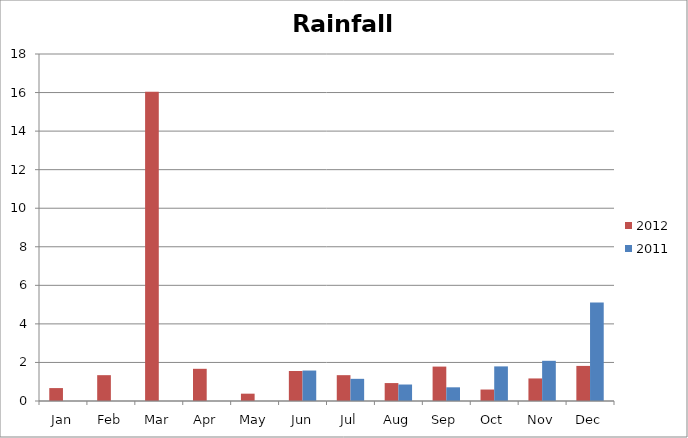
| Category | 2012 | 2011 |
|---|---|---|
| Jan | 0.67 | 0 |
| Feb | 1.34 | 0 |
| Mar | 16.04 | 0 |
| Apr | 1.67 | 0 |
| May | 0.38 | 0 |
| Jun | 1.555 | 1.58 |
| Jul | 1.34 | 1.15 |
| Aug | 0.93 | 0.855 |
| Sep | 1.785 | 0.71 |
| Oct | 0.595 | 1.795 |
| Nov | 1.17 | 2.085 |
| Dec | 1.82 | 5.11 |